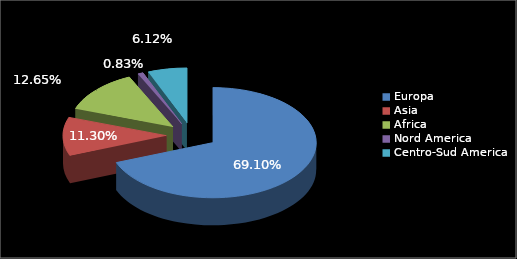
| Category | Numero Persone |
|---|---|
| Europa | 1333 |
| Asia | 218 |
| Africa | 244 |
| Nord America | 16 |
| Centro-Sud America | 118 |